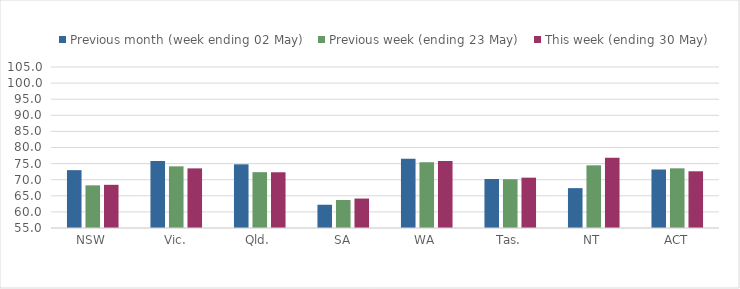
| Category | Previous month (week ending 02 May) | Previous week (ending 23 May) | This week (ending 30 May) |
|---|---|---|---|
| NSW | 72.967 | 68.254 | 68.412 |
| Vic. | 75.843 | 74.144 | 73.518 |
| Qld. | 74.776 | 72.341 | 72.308 |
| SA | 62.22 | 63.694 | 64.15 |
| WA | 76.472 | 75.392 | 75.797 |
| Tas. | 70.209 | 70.153 | 70.633 |
| NT | 67.381 | 74.464 | 76.809 |
| ACT | 73.167 | 73.531 | 72.615 |